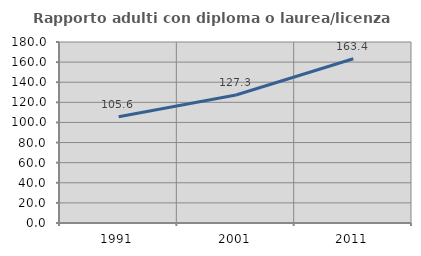
| Category | Rapporto adulti con diploma o laurea/licenza media  |
|---|---|
| 1991.0 | 105.634 |
| 2001.0 | 127.273 |
| 2011.0 | 163.366 |